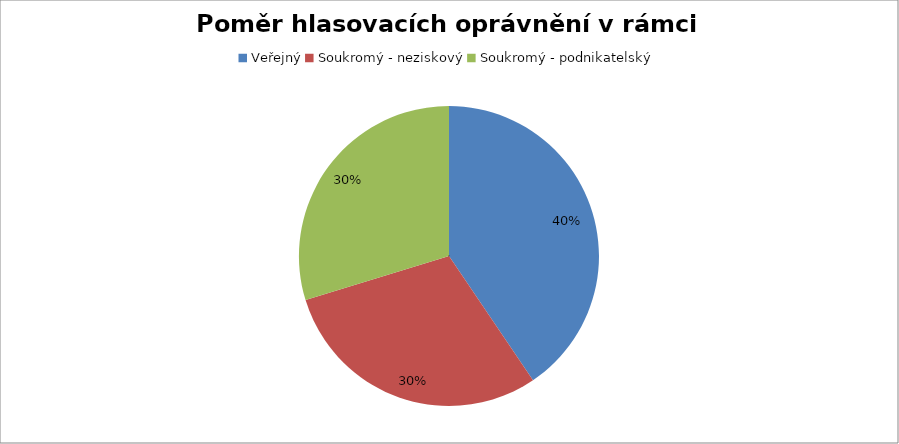
| Category | Series 0 |
|---|---|
| Veřejný | 0.405 |
| Soukromý - neziskový | 0.297 |
| Soukromý - podnikatelský | 0.297 |